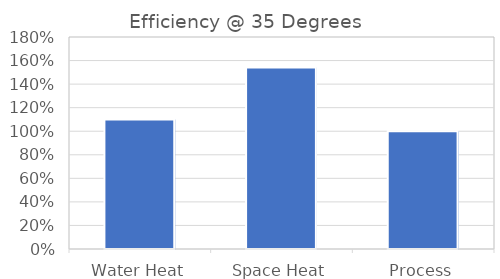
| Category | Series 0 |
|---|---|
| Water Heat | 1.1 |
| Space Heat | 1.54 |
| Process | 1 |